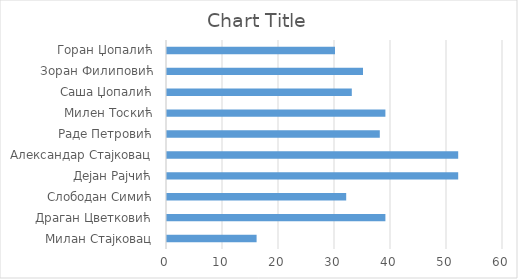
| Category | Series 0 |
|---|---|
| Милан Стајковац | 16 |
| Драган Цветковић | 39 |
| Слободан Симић | 32 |
| Дејан Рајчић | 52 |
| Александар Стајковац | 52 |
| Раде Петровић | 38 |
| Милен Тоскић | 39 |
| Саша Џопалић | 33 |
| Зоран Филиповић | 35 |
| Горан Џопалић | 30 |